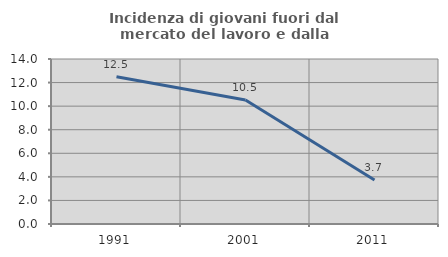
| Category | Incidenza di giovani fuori dal mercato del lavoro e dalla formazione  |
|---|---|
| 1991.0 | 12.5 |
| 2001.0 | 10.526 |
| 2011.0 | 3.738 |